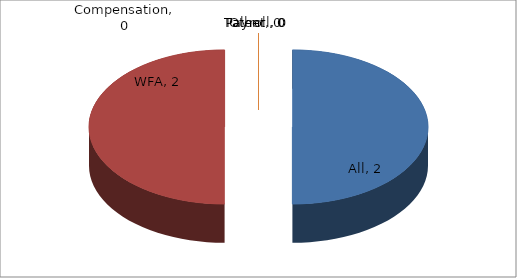
| Category | Series 0 |
|---|---|
| All | 2 |
| WFA | 2 |
| Payroll | 0 |
| Talent  | 0 |
| Compensation | 0 |
| Other | 0 |